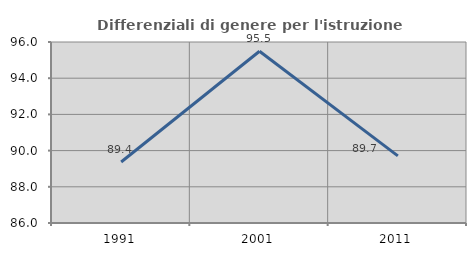
| Category | Differenziali di genere per l'istruzione superiore |
|---|---|
| 1991.0 | 89.372 |
| 2001.0 | 95.487 |
| 2011.0 | 89.708 |